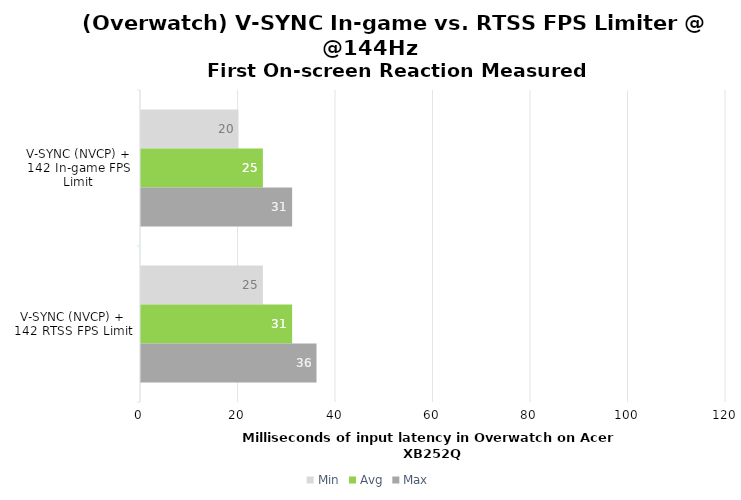
| Category | Min | Avg | Max |
|---|---|---|---|
| V-SYNC (NVCP) + 142 In-game FPS Limit | 20 | 25 | 31 |
| V-SYNC (NVCP) + 142 RTSS FPS Limit | 25 | 31 | 36 |